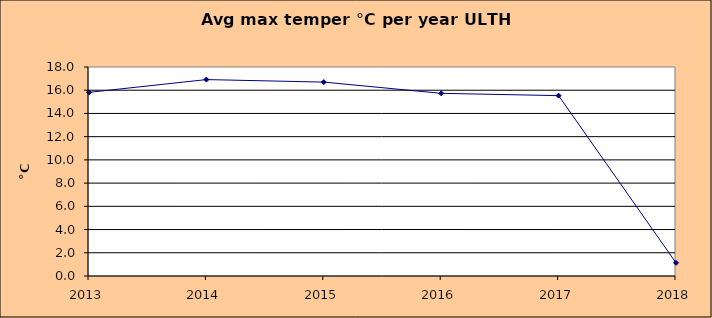
| Category | Series 0 |
|---|---|
| 2013.0 | 15.817 |
| 2014.0 | 16.917 |
| 2015.0 | 16.7 |
| 2016.0 | 15.733 |
| 2017.0 | 15.533 |
| 2018.0 | 1.133 |